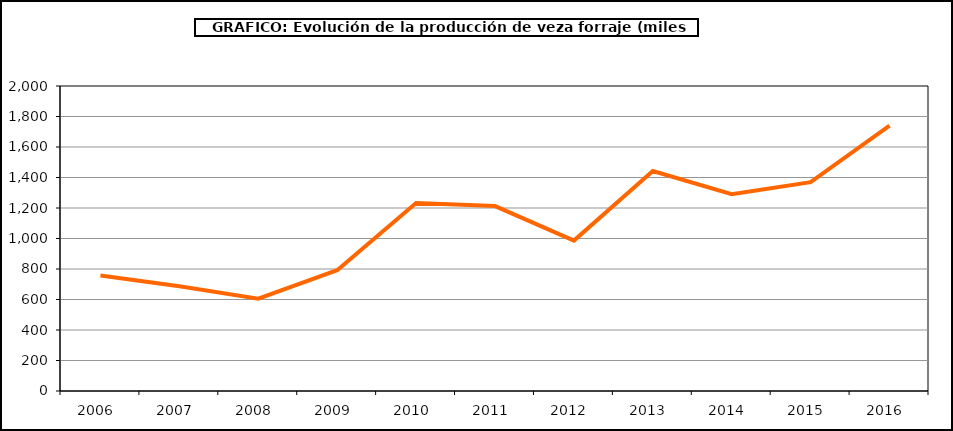
| Category | Producción |
|---|---|
| 2006.0 | 756.947 |
| 2007.0 | 686.571 |
| 2008.0 | 605.65 |
| 2009.0 | 791.875 |
| 2010.0 | 1232.646 |
| 2011.0 | 1212.426 |
| 2012.0 | 986.263 |
| 2013.0 | 1442.069 |
| 2014.0 | 1290.565 |
| 2015.0 | 1369.532 |
| 2016.0 | 1740.854 |